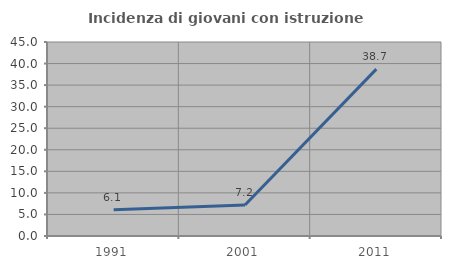
| Category | Incidenza di giovani con istruzione universitaria |
|---|---|
| 1991.0 | 6.061 |
| 2001.0 | 7.207 |
| 2011.0 | 38.71 |